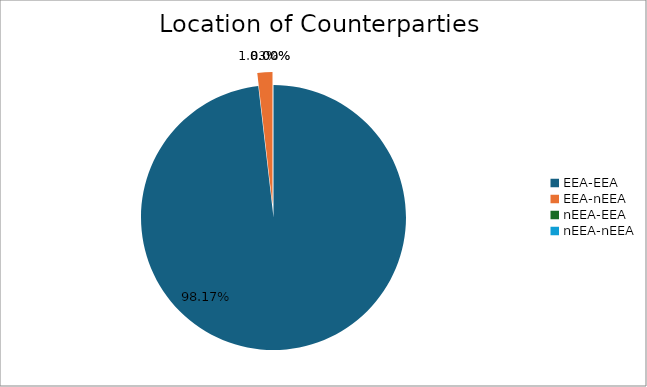
| Category | Series 0 |
|---|---|
| EEA-EEA | 42139.659 |
| EEA-nEEA | 787.246 |
| nEEA-EEA | 0 |
| nEEA-nEEA | 0 |